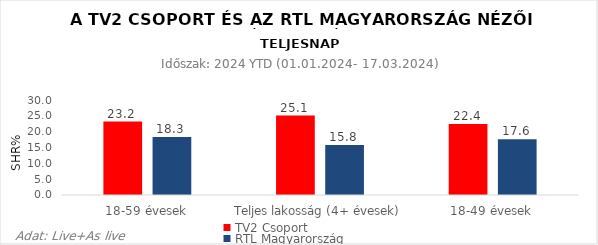
| Category | TV2 Csoport | RTL Magyarország |
|---|---|---|
| 18-59 évesek | 23.2 | 18.3 |
| Teljes lakosság (4+ évesek) | 25.1 | 15.8 |
| 18-49 évesek | 22.4 | 17.6 |